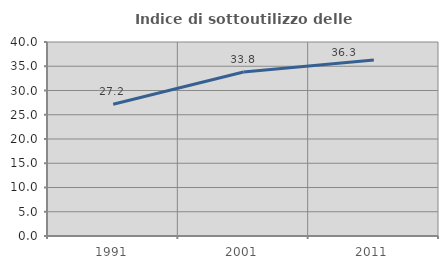
| Category | Indice di sottoutilizzo delle abitazioni  |
|---|---|
| 1991.0 | 27.151 |
| 2001.0 | 33.803 |
| 2011.0 | 36.292 |